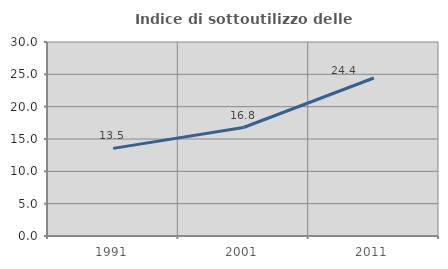
| Category | Indice di sottoutilizzo delle abitazioni  |
|---|---|
| 1991.0 | 13.549 |
| 2001.0 | 16.775 |
| 2011.0 | 24.436 |